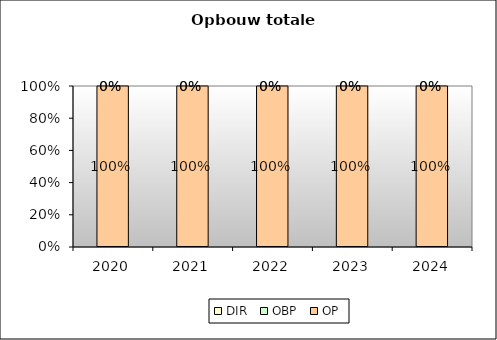
| Category | OP | OBP | DIR |
|---|---|---|---|
| 2020.0 | 1 | 0 | 0 |
| 2021.0 | 1 | 0 | 0 |
| 2022.0 | 1 | 0 | 0 |
| 2023.0 | 1 | 0 | 0 |
| 2024.0 | 1 | 0 | 0 |